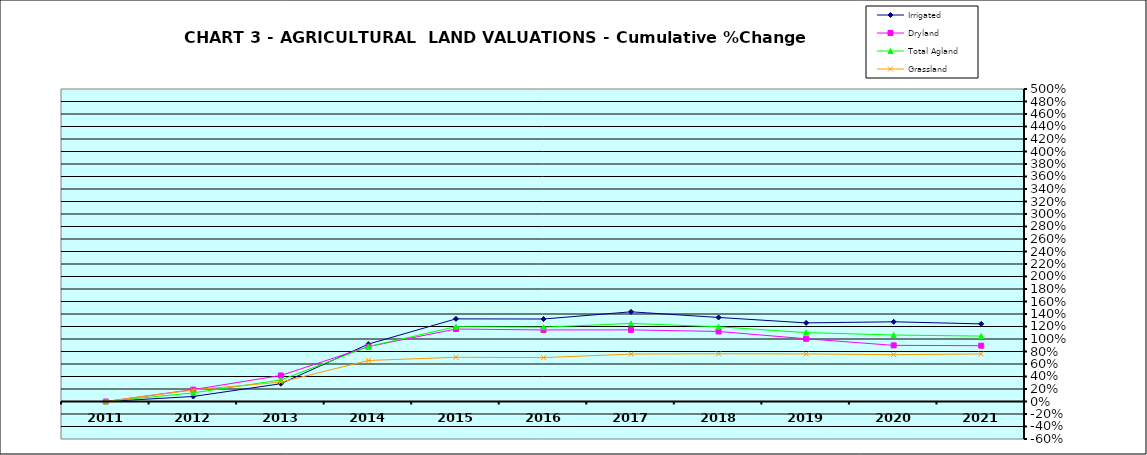
| Category | Irrigated | Dryland | Total Agland | Grassland |
|---|---|---|---|---|
| 2011.0 | 0 | 0 | 0 | 0 |
| 2012.0 | 0.081 | 0.19 | 0.138 | 0.186 |
| 2013.0 | 0.284 | 0.416 | 0.344 | 0.31 |
| 2014.0 | 0.919 | 0.879 | 0.878 | 0.657 |
| 2015.0 | 1.322 | 1.16 | 1.197 | 0.708 |
| 2016.0 | 1.32 | 1.145 | 1.189 | 0.702 |
| 2017.0 | 1.435 | 1.146 | 1.249 | 0.759 |
| 2018.0 | 1.345 | 1.121 | 1.195 | 0.763 |
| 2019.0 | 1.258 | 1.004 | 1.103 | 0.76 |
| 2020.0 | 1.275 | 0.898 | 1.064 | 0.749 |
| 2021.0 | 1.242 | 0.893 | 1.046 | 0.76 |